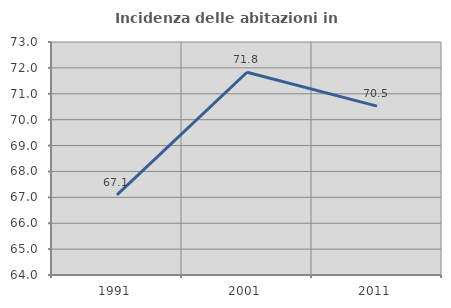
| Category | Incidenza delle abitazioni in proprietà  |
|---|---|
| 1991.0 | 67.092 |
| 2001.0 | 71.832 |
| 2011.0 | 70.525 |